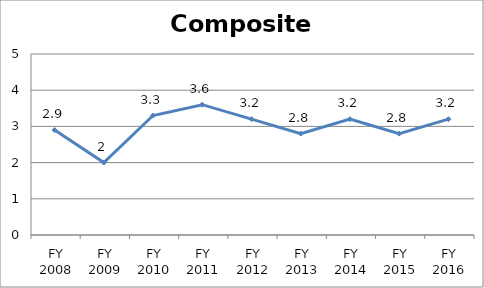
| Category | Composite score |
|---|---|
| FY 2016 | 3.2 |
| FY 2015 | 2.8 |
| FY 2014 | 3.2 |
| FY 2013 | 2.8 |
| FY 2012 | 3.2 |
| FY 2011 | 3.6 |
| FY 2010 | 3.3 |
| FY 2009 | 2 |
| FY 2008 | 2.9 |